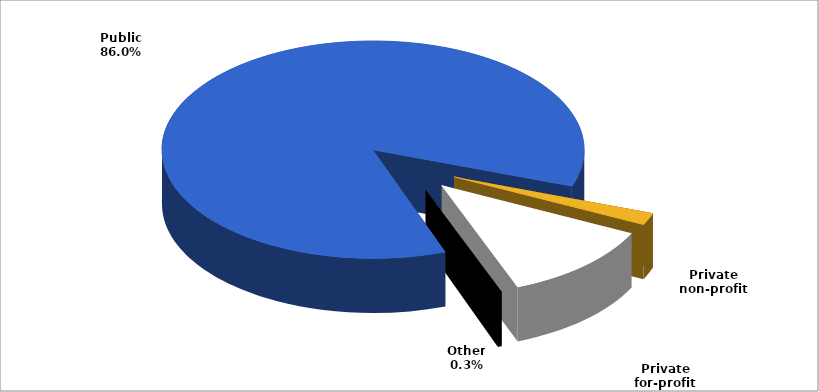
| Category | Series 0 |
|---|---|
| Public | 0.86 |
| Private non-profit | 0.018 |
| Private for-profit | 0.119 |
| Other | 0.003 |